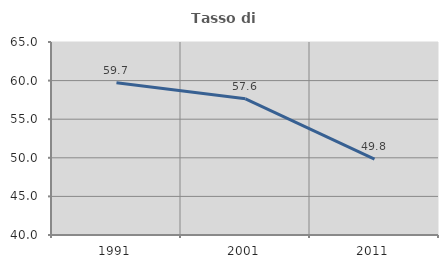
| Category | Tasso di occupazione   |
|---|---|
| 1991.0 | 59.724 |
| 2001.0 | 57.646 |
| 2011.0 | 49.835 |